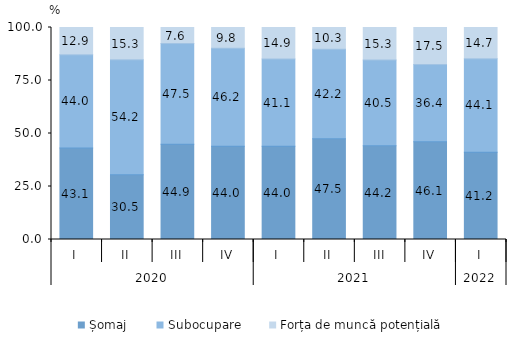
| Category | Șomaj | Subocupare | Forța de muncă potențială |
|---|---|---|---|
| 0 | 43.127 | 44.01 | 12.863 |
| 1 | 30.523 | 54.216 | 15.261 |
| 2 | 44.874 | 47.548 | 7.578 |
| 3 | 44 | 46.2 | 9.8 |
| 4 | 44 | 41.1 | 14.9 |
| 5 | 47.504 | 42.209 | 10.287 |
| 6 | 44.2 | 40.5 | 15.3 |
| 7 | 46.1 | 36.4 | 17.5 |
| 8 | 41.2 | 44.1 | 14.7 |